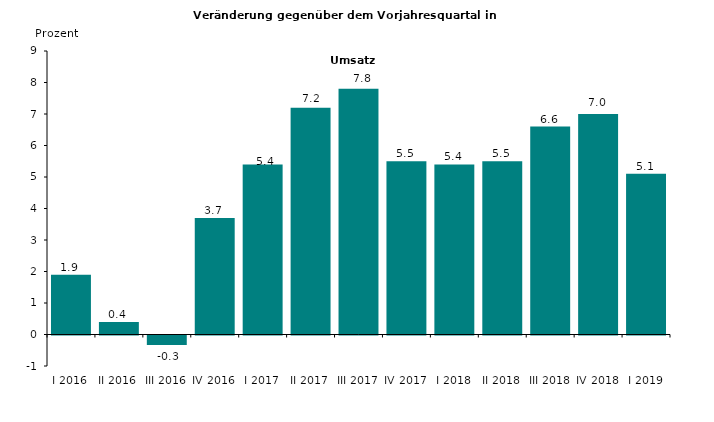
| Category | Series 0 |
|---|---|
| I 2016 | 1.9 |
| II 2016 | 0.4 |
| III 2016 | -0.3 |
| IV 2016 | 3.7 |
| I 2017 | 5.4 |
| II 2017 | 7.2 |
| III 2017 | 7.8 |
| IV 2017 | 5.5 |
| I 2018 | 5.4 |
| II 2018 | 5.5 |
| III 2018 | 6.6 |
| IV 2018 | 7 |
| I 2019 | 5.1 |